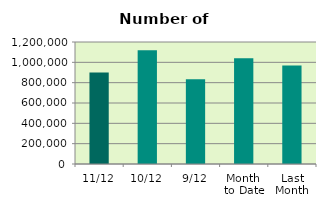
| Category | Series 0 |
|---|---|
| 11/12 | 898830 |
| 10/12 | 1119572 |
| 9/12 | 832576 |
| Month 
to Date | 1041167.25 |
| Last
Month | 969317.238 |